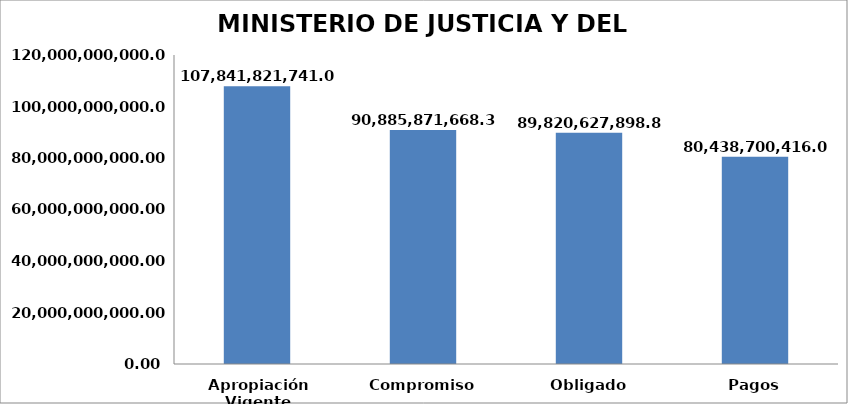
| Category | Series 0 |
|---|---|
| Apropiación Vigente | 107841821741 |
| Compromiso | 90885871668.339 |
| Obligado | 89820627898.871 |
| Pagos | 80438700416.051 |